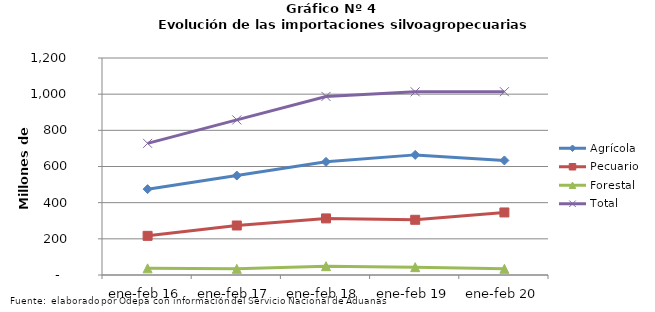
| Category | Agrícola | Pecuario | Forestal | Total |
|---|---|---|---|---|
| ene-feb 16 | 474734 | 216531 | 36755 | 728020 |
| ene-feb 17 | 549829 | 273737 | 34063 | 857629 |
| ene-feb 18 | 625733 | 312937 | 48836 | 987506 |
| ene-feb 19 | 664262 | 305286 | 43402 | 1012950 |
| ene-feb 20 | 633552 | 345840 | 34174 | 1013566 |